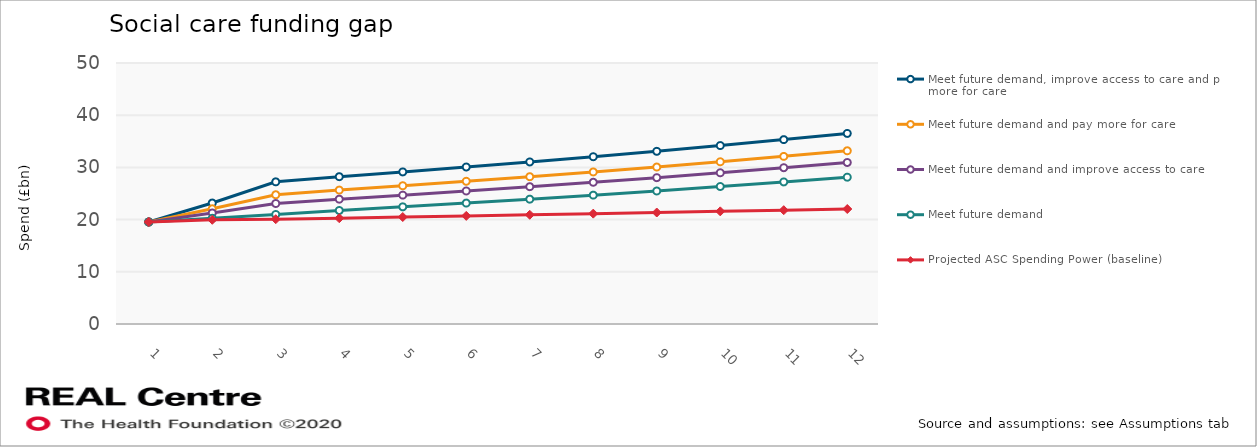
| Category | Meet future demand, improve access to care and pay more for care | Meet future demand and pay more for care | Meet future demand and improve access to care | Meet future demand | Projected ASC Spending Power (baseline) |
|---|---|---|---|---|---|
| 0 | 19.543 | 19.543 | 19.543 | 19.543 | 19.543 |
| 1 | 23.177 | 22.073 | 21.263 | 20.25 | 19.963 |
| 2 | 27.236 | 24.76 | 23.081 | 20.983 | 20.077 |
| 3 | 28.221 | 25.656 | 23.916 | 21.742 | 20.264 |
| 4 | 29.132 | 26.483 | 24.688 | 22.444 | 20.496 |
| 5 | 30.072 | 27.338 | 25.485 | 23.168 | 20.708 |
| 6 | 31.042 | 28.22 | 26.307 | 23.915 | 20.923 |
| 7 | 32.044 | 29.131 | 27.156 | 24.687 | 21.14 |
| 8 | 33.078 | 30.071 | 28.032 | 25.484 | 21.359 |
| 9 | 34.183 | 31.075 | 28.969 | 26.335 | 21.58 |
| 10 | 35.325 | 32.113 | 29.936 | 27.215 | 21.804 |
| 11 | 36.505 | 33.186 | 30.936 | 28.124 | 22.03 |